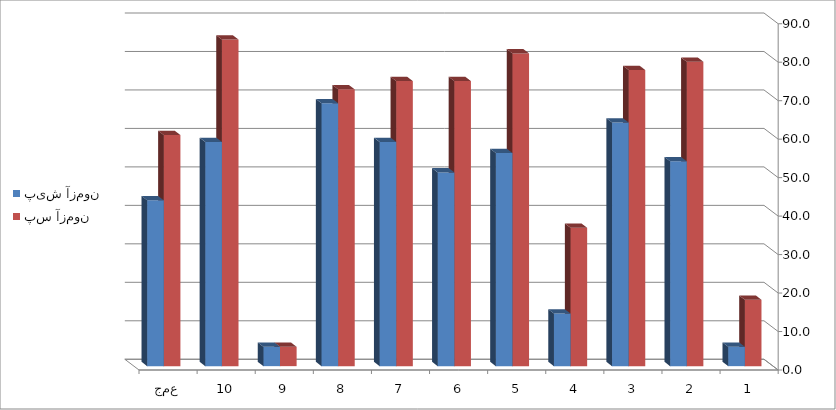
| Category | پیش آزمون | پس آزمون |
|---|---|---|
| 1 | 5.036 | 17.266 |
| 2 | 53.237 | 79.137 |
| 3 | 63.309 | 76.978 |
| 4 | 13.669 | 35.971 |
| 5 | 55.396 | 81.295 |
| 6 | 50.36 | 74.101 |
| 7 | 58.273 | 74.101 |
| 8 | 68.345 | 71.942 |
| 9 | 5.036 | 5.036 |
| 10 | 58.273 | 84.892 |
| جمع | 43.094 | 60.072 |